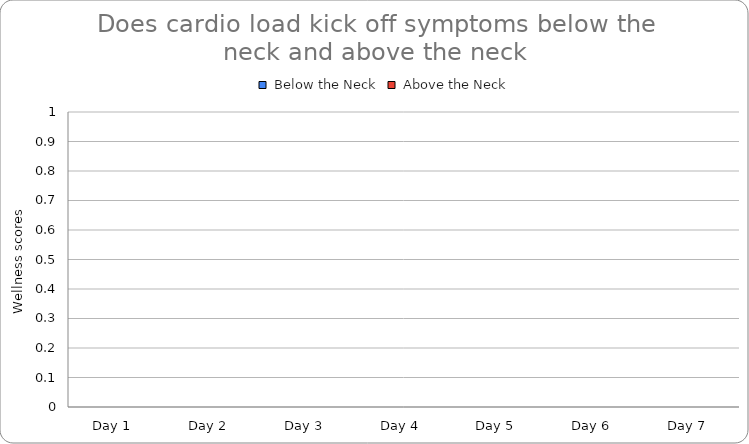
| Category | Below the Neck | Above the Neck |
|---|---|---|
| Day 1  | 0 | 0 |
| Day 2  | 0 | 0 |
| Day 3  | 0 | 0 |
| Day 4  | 0 | 0 |
| Day 5  | 0 | 0 |
| Day 6  | 0 | 0 |
| Day 7  | 0 | 0 |